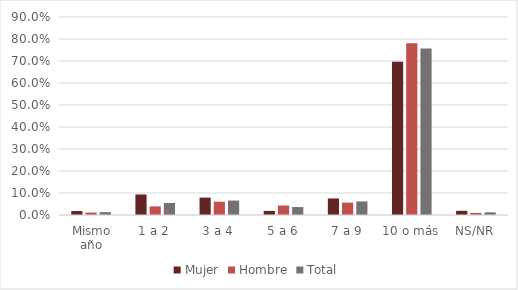
| Category | Mujer | Hombre | Total |
|---|---|---|---|
| Mismo año | 0.018 | 0.011 | 0.013 |
| 1 a 2 | 0.093 | 0.039 | 0.055 |
| 3 a 4 | 0.079 | 0.06 | 0.066 |
| 5 a 6 | 0.019 | 0.043 | 0.036 |
| 7 a 9 | 0.075 | 0.056 | 0.062 |
| 10 o más | 0.697 | 0.781 | 0.757 |
| NS/NR | 0.019 | 0.009 | 0.012 |